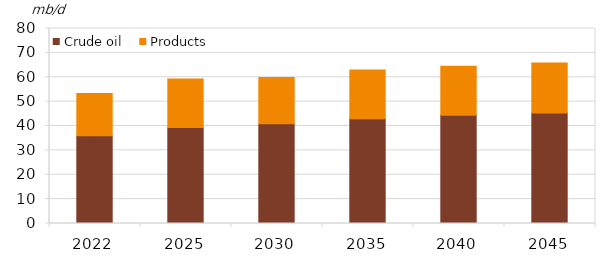
| Category | Crude oil  | Products  |
|---|---|---|
| 2022.0 | 36.026 | 17.314 |
| 2025.0 | 39.338 | 19.976 |
| 2030.0 | 40.965 | 18.945 |
| 2035.0 | 42.993 | 19.962 |
| 2040.0 | 44.4 | 20.146 |
| 2045.0 | 45.329 | 20.482 |